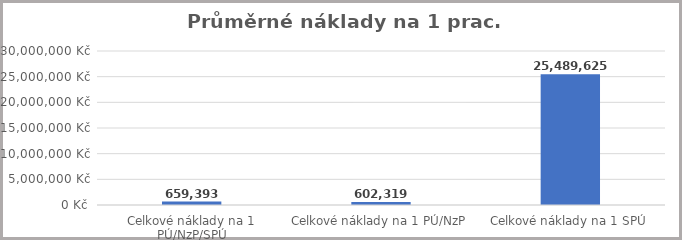
| Category | Hodnota |
|---|---|
| Celkové náklady na 1 PÚ/NzP/SPÚ | 659392.752 |
| Celkové náklady na 1 PÚ/NzP | 602318.937 |
| Celkové náklady na 1 SPÚ | 25489624.575 |